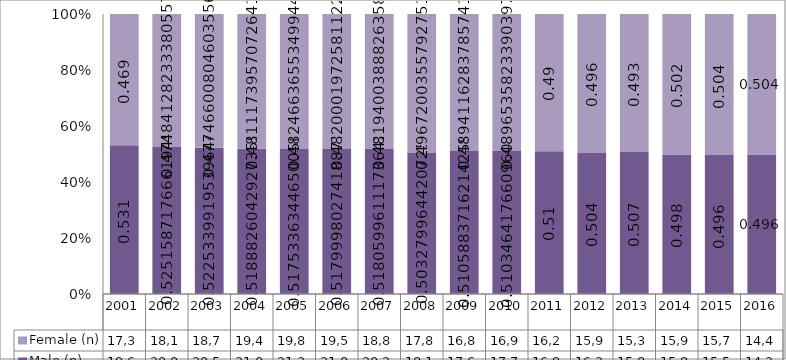
| Category | Male (n) | Female (n) |
|---|---|---|
| 2001.0 | 19662 | 17373 |
| 2002.0 | 20018 | 18100 |
| 2003.0 | 20522 | 18752 |
| 2004.0 | 21008 | 19479 |
| 2005.0 | 21311 | 19867 |
| 2006.0 | 21008 | 19548 |
| 2007.0 | 20252 | 18840 |
| 2008.0 | 18106 | 17870 |
| 2009.0 | 17625 | 16894 |
| 2010.0 | 17708 | 16990 |
| 2011.0 | 16940 | 16276 |
| 2012.0 | 16220 | 15984 |
| 2013.0 | 15826 | 15397 |
| 2014.0 | 15861 | 15983 |
| 2015.0 | 15502 | 15752 |
| 2016.0 | 14238 | 14455 |